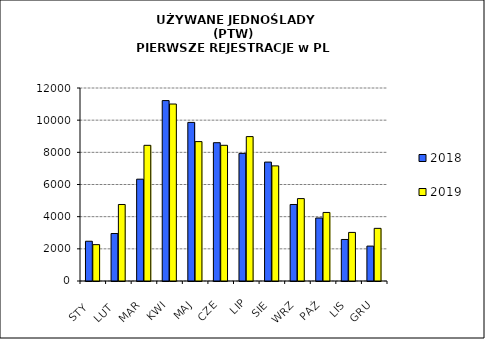
| Category | 2018 | 2019 |
|---|---|---|
|  STY  | 2472 | 2260 |
|  LUT  | 2952 | 4757 |
| MAR | 6331 | 8436 |
| KWI | 11217 | 11004 |
| MAJ | 9861 | 8667 |
| CZE | 8599 | 8437 |
| LIP | 7934 | 8978 |
| SIE | 7394 | 7158 |
| WRZ | 4757 | 5123 |
| PAŹ | 3918 | 4262 |
| LIS | 2582 | 3021 |
| GRU | 2170 | 3273 |